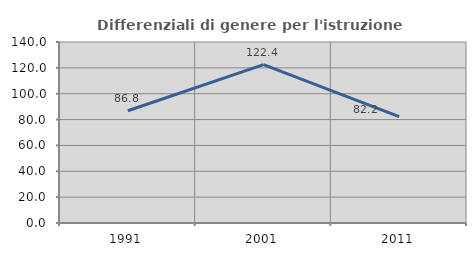
| Category | Differenziali di genere per l'istruzione superiore |
|---|---|
| 1991.0 | 86.822 |
| 2001.0 | 122.444 |
| 2011.0 | 82.245 |